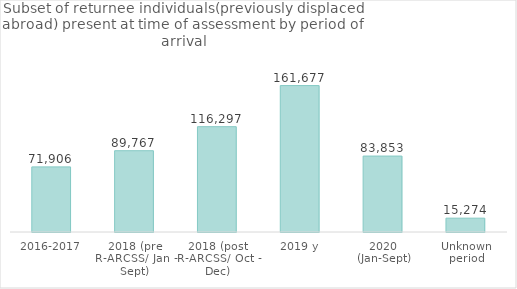
| Category | Total |
|---|---|
| 2016-2017 | 71906 |
| 2018 (pre R-ARCSS/ Jan - Sept) | 89767 |
| 2018 (post R-ARCSS/ Oct - Dec) | 116297 |
| 2019 y | 161677 |
| 2020 (Jan-Sept) | 83853 |
| Unknown period | 15274 |